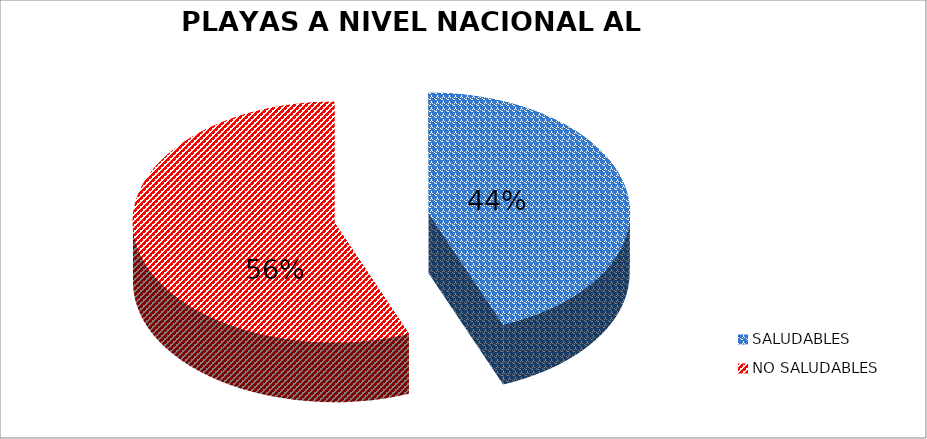
| Category | N.° |
|---|---|
| SALUDABLES | 109 |
| NO SALUDABLES | 139 |